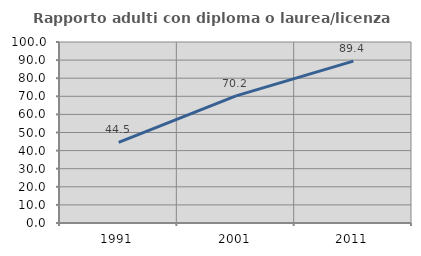
| Category | Rapporto adulti con diploma o laurea/licenza media  |
|---|---|
| 1991.0 | 44.525 |
| 2001.0 | 70.225 |
| 2011.0 | 89.42 |